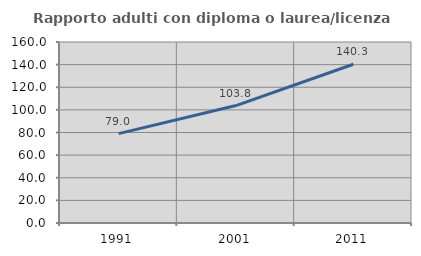
| Category | Rapporto adulti con diploma o laurea/licenza media  |
|---|---|
| 1991.0 | 78.974 |
| 2001.0 | 103.814 |
| 2011.0 | 140.332 |